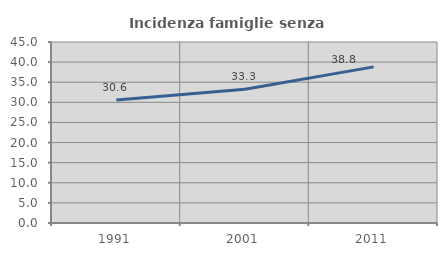
| Category | Incidenza famiglie senza nuclei |
|---|---|
| 1991.0 | 30.554 |
| 2001.0 | 33.269 |
| 2011.0 | 38.82 |